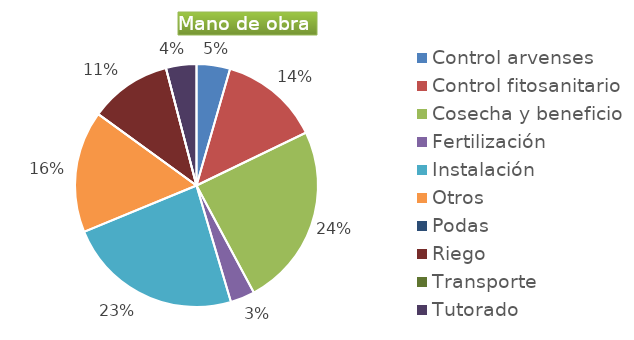
| Category | Series 0 |
|---|---|
| Control arvenses | 550000 |
| Control fitosanitario | 1650000 |
| Cosecha y beneficio | 3000600 |
| Fertilización | 400000 |
| Instalación | 2880316 |
| Otros | 2000000 |
| Podas | 0 |
| Riego | 1350000 |
| Transporte | 0 |
| Tutorado | 500000 |